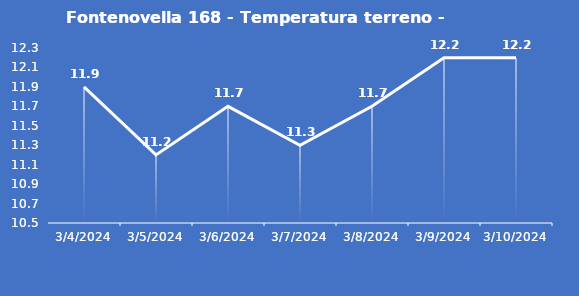
| Category | Fontenovella 168 - Temperatura terreno - Grezzo (°C) |
|---|---|
| 3/4/24 | 11.9 |
| 3/5/24 | 11.2 |
| 3/6/24 | 11.7 |
| 3/7/24 | 11.3 |
| 3/8/24 | 11.7 |
| 3/9/24 | 12.2 |
| 3/10/24 | 12.2 |